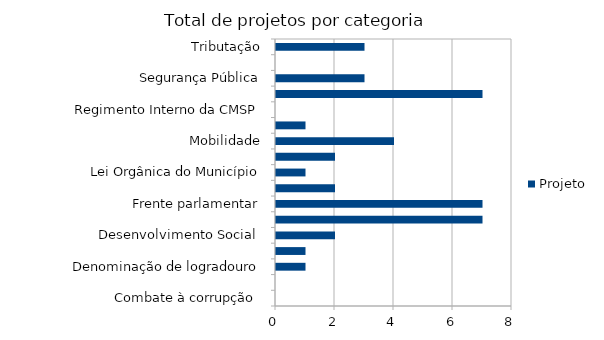
| Category | Projeto |
|---|---|
| Combate à corrupção  | 0 |
| Datas comemorativas e homenagens diversas | 0 |
| Denominação de logradouro | 1 |
| Desenvolvimento Econômico | 1 |
| Desenvolvimento Social  | 2 |
| Educação e cultura | 7 |
| Frente parlamentar | 7 |
| Habitação e Urbanismo | 2 |
| Lei Orgânica do Município | 1 |
| Meio ambiente ,  | 2 |
| Mobilidade | 4 |
| Proteção dos animais | 1 |
| Regimento Interno da CMSP | 0 |
| Saude-Esporte | 7 |
| Segurança Pública | 3 |
| Transparencia | 0 |
| Tributação | 3 |